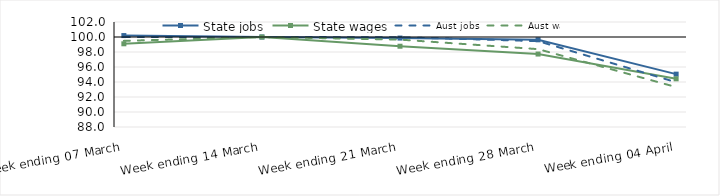
| Category | State jobs | State wages | Aust jobs | Aust wages |
|---|---|---|---|---|
| 2020-03-07 | 100.191 | 99.094 | 100.003 | 99.487 |
| 2020-03-14 | 100 | 100 | 100 | 100 |
| 2020-03-21 | 99.857 | 98.77 | 99.966 | 99.652 |
| 2020-03-28 | 99.626 | 97.728 | 99.451 | 98.382 |
| 2020-04-04 | 95.047 | 94.424 | 93.968 | 93.326 |